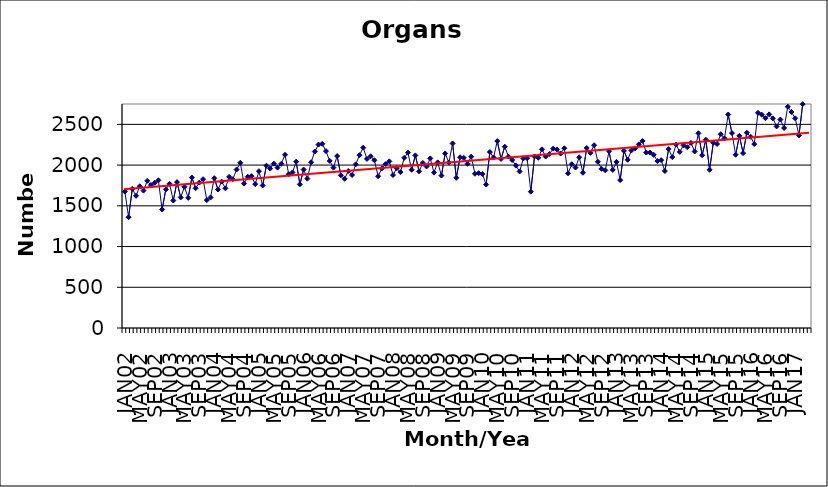
| Category | Series 0 |
|---|---|
| JAN02 | 1675 |
| FEB02 | 1360 |
| MAR02 | 1708 |
| APR02 | 1623 |
| MAY02 | 1740 |
| JUN02 | 1687 |
| JUL02 | 1806 |
| AUG02 | 1755 |
| SEP02 | 1783 |
| OCT02 | 1813 |
| NOV02 | 1455 |
| DEC02 | 1701 |
| JAN03 | 1770 |
| FEB03 | 1565 |
| MAR03 | 1791 |
| APR03 | 1603 |
| MAY03 | 1734 |
| JUN03 | 1598 |
| JUL03 | 1847 |
| AUG03 | 1716 |
| SEP03 | 1785 |
| OCT03 | 1827 |
| NOV03 | 1570 |
| DEC03 | 1602 |
| JAN04 | 1839 |
| FEB04 | 1700 |
| MAR04 | 1797 |
| APR04 | 1715 |
| MAY04 | 1855 |
| JUN04 | 1827 |
| JUL04 | 1945 |
| AUG04 | 2028 |
| SEP04 | 1773 |
| OCT04 | 1857 |
| NOV04 | 1864 |
| DEC04 | 1766 |
| JAN05 | 1925 |
| FEB05 | 1750 |
| MAR05 | 1993 |
| APR05 | 1957 |
| MAY05 | 2018 |
| JUN05 | 1969 |
| JUL05 | 2016 |
| AUG05 | 2127 |
| SEP05 | 1888 |
| OCT05 | 1910 |
| NOV05 | 2042 |
| DEC05 | 1764 |
| JAN06 | 1945 |
| FEB06 | 1834 |
| MAR06 | 2035 |
| APR06 | 2167 |
| MAY06 | 2252 |
| JUN06 | 2261 |
| JUL06 | 2172 |
| AUG06 | 2051 |
| SEP06 | 1969 |
| OCT06 | 2111 |
| NOV06 | 1875 |
| DEC06 | 1832 |
| JAN07 | 1927 |
| FEB07 | 1878 |
| MAR07 | 2009 |
| APR07 | 2122 |
| MAY07 | 2214 |
| JUN07 | 2076 |
| JUL07 | 2108 |
| AUG07 | 2060 |
| SEP07 | 1863 |
| OCT07 | 1959 |
| NOV07 | 2012 |
| DEC07 | 2046 |
| JAN08 | 1878 |
| FEB08 | 1962 |
| MAR08 | 1914 |
| APR08 | 2089 |
| MAY08 | 2153 |
| JUN08 | 1942 |
| JUL08 | 2119 |
| AUG08 | 1923 |
| SEP08 | 2026 |
| OCT08 | 1983 |
| NOV08 | 2082 |
| DEC08 | 1908 |
| JAN09 | 2033 |
| FEB09 | 1871 |
| MAR09 | 2143 |
| APR09 | 2032 |
| MAY09 | 2266 |
| JUN09 | 1844 |
| JUL09 | 2096 |
| AUG09 | 2089 |
| SEP09 | 2016 |
| OCT09 | 2104 |
| NOV09 | 1894 |
| DEC09 | 1901 |
| JAN10 | 1890 |
| FEB10 | 1761 |
| MAR10 | 2160 |
| APR10 | 2094 |
| MAY10 | 2295 |
| JUN10 | 2075 |
| JUL10 | 2226 |
| AUG10 | 2104 |
| SEP10 | 2062 |
| OCT10 | 1994 |
| NOV10 | 1922 |
| DEC10 | 2082 |
| JAN11 | 2085 |
| FEB11 | 1674 |
| MAR11 | 2106 |
| APR11 | 2090 |
| MAY11 | 2194 |
| JUN11 | 2105 |
| JUL11 | 2136 |
| AUG11 | 2202 |
| SEP11 | 2192 |
| OCT11 | 2142 |
| NOV11 | 2207 |
| DEC11 | 1899 |
| JAN12 | 2011 |
| FEB12 | 1970 |
| MAR12 | 2096 |
| APR12 | 1906 |
| MAY12 | 2210 |
| JUN12 | 2150 |
| JUL12 | 2244 |
| AUG12 | 2041 |
| SEP12 | 1954 |
| OCT12 | 1936 |
| NOV12 | 2170 |
| DEC12 | 1941 |
| JAN13 | 2039 |
| FEB13 | 1816 |
| MAR13 | 2175 |
| APR13 | 2065 |
| MAY13 | 2179 |
| JUN13 | 2205 |
| JUL13 | 2254 |
| AUG13 | 2297 |
| SEP13 | 2154 |
| OCT13 | 2154 |
| NOV13 | 2126 |
| DEC13 | 2049 |
| JAN14 | 2061 |
| FEB14 | 1927 |
| MAR14 | 2197 |
| APR14 | 2098 |
| MAY14 | 2251 |
| JUN14 | 2162 |
| JUL14 | 2243 |
| AUG14 | 2220 |
| SEP14 | 2272 |
| OCT14 | 2167 |
| NOV14 | 2391 |
| DEC14 | 2121 |
| JAN15 | 2312 |
| FEB15 | 1942 |
| MAR15 | 2275 |
| APR15 | 2259 |
| MAY15 | 2379 |
| JUN15 | 2328 |
| JUL15 | 2621 |
| AUG15 | 2393 |
| SEP15 | 2127 |
| OCT15 | 2359 |
| NOV15 | 2147 |
| DEC15 | 2398 |
| JAN16 | 2348 |
| FEB16 | 2258 |
| MAR16 | 2642 |
| APR16 | 2619 |
| MAY16 | 2576 |
| JUN16 | 2623 |
| JUL16 | 2573 |
| AUG16 | 2475 |
| SEP16 | 2559 |
| OCT16 | 2455 |
| NOV16 | 2717 |
| DEC16 | 2652 |
| JAN17 | 2574 |
| FEB17 | 2364 |
| MAR17 | 2748 |